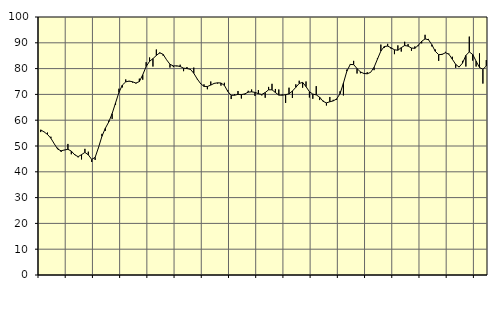
| Category | Piggar | Series 1 |
|---|---|---|
| nan | 55.4 | 56.25 |
| 87.0 | 55.5 | 55.45 |
| 87.0 | 55.2 | 54.48 |
| 87.0 | 53.6 | 53 |
| nan | 50.8 | 50.82 |
| 88.0 | 49.3 | 48.79 |
| 88.0 | 47.7 | 48.13 |
| 88.0 | 48.4 | 48.47 |
| nan | 50.8 | 48.72 |
| 89.0 | 46.8 | 48.03 |
| 89.0 | 46.9 | 46.59 |
| 89.0 | 45.6 | 45.87 |
| nan | 44.8 | 46.64 |
| 90.0 | 48.9 | 47.52 |
| 90.0 | 47.8 | 46.57 |
| 90.0 | 43.8 | 44.8 |
| nan | 44.6 | 45.58 |
| 91.0 | 49.2 | 49.44 |
| 91.0 | 54.7 | 53.76 |
| 91.0 | 55.9 | 56.87 |
| nan | 59.8 | 59.3 |
| 92.0 | 60.5 | 62.55 |
| 92.0 | 65.9 | 66.69 |
| 92.0 | 72.2 | 70.76 |
| nan | 72.7 | 73.61 |
| 93.0 | 75.8 | 74.86 |
| 93.0 | 75 | 75.17 |
| 93.0 | 74.6 | 74.88 |
| nan | 74.2 | 74.39 |
| 94.0 | 76.1 | 74.98 |
| 94.0 | 75.7 | 77.6 |
| 94.0 | 82.5 | 80.82 |
| nan | 84.3 | 82.81 |
| 95.0 | 80.8 | 83.87 |
| 95.0 | 87.4 | 85.09 |
| 95.0 | 85.9 | 86.15 |
| nan | 85 | 85.51 |
| 96.0 | 83.4 | 83.43 |
| 96.0 | 80.4 | 81.68 |
| 96.0 | 80.6 | 81.03 |
| nan | 80.9 | 81.08 |
| 97.0 | 81.5 | 80.82 |
| 97.0 | 79 | 80.17 |
| 97.0 | 80.6 | 80.03 |
| nan | 79.5 | 79.73 |
| 98.0 | 80.4 | 78.2 |
| 98.0 | 75.9 | 76.02 |
| 98.0 | 74.4 | 74.2 |
| nan | 73.9 | 73.1 |
| 99.0 | 72 | 73.06 |
| 99.0 | 75 | 73.61 |
| 99.0 | 74.4 | 74.27 |
| nan | 74.2 | 74.49 |
| 0.0 | 73.4 | 74.42 |
| 0.0 | 74.5 | 73.49 |
| 0.0 | 71.6 | 71.17 |
| nan | 68.2 | 69.64 |
| 1.0 | 70.1 | 69.68 |
| 1.0 | 71.3 | 70.01 |
| 1.0 | 68.4 | 69.91 |
| nan | 69.9 | 70.2 |
| 2.0 | 71.4 | 70.86 |
| 2.0 | 71.9 | 71 |
| 2.0 | 69.4 | 70.78 |
| nan | 71.7 | 70.28 |
| 3.0 | 69.6 | 69.96 |
| 3.0 | 68.7 | 70.72 |
| 3.0 | 72.9 | 71.78 |
| nan | 74.1 | 71.79 |
| 4.0 | 72.1 | 70.73 |
| 4.0 | 71.9 | 69.72 |
| 4.0 | 70 | 69.68 |
| nan | 66.7 | 69.89 |
| 5.0 | 72.6 | 70.22 |
| 5.0 | 68.6 | 71.31 |
| 5.0 | 73.9 | 72.74 |
| nan | 75.3 | 74.24 |
| 6.0 | 72.6 | 74.65 |
| 6.0 | 75 | 73.01 |
| 6.0 | 68.8 | 71.06 |
| nan | 68.3 | 70.11 |
| 7.0 | 73.2 | 69.82 |
| 7.0 | 67.8 | 68.94 |
| 7.0 | 67.6 | 67.33 |
| nan | 65.7 | 66.72 |
| 8.0 | 69 | 67.14 |
| 8.0 | 67.9 | 67.48 |
| 8.0 | 67.9 | 68.23 |
| nan | 71.2 | 70.26 |
| 9.0 | 69.6 | 74.36 |
| 9.0 | 79.6 | 78.98 |
| 9.0 | 81.8 | 81.6 |
| nan | 83 | 81.55 |
| 10.0 | 78.1 | 80.02 |
| 10.0 | 78.2 | 78.7 |
| 10.0 | 78 | 78.12 |
| nan | 78.6 | 77.98 |
| 11.0 | 78.6 | 78.56 |
| 11.0 | 79.4 | 80.49 |
| 11.0 | 84.1 | 83.67 |
| nan | 89.3 | 86.79 |
| 12.0 | 88 | 88.56 |
| 12.0 | 89.6 | 88.72 |
| 12.0 | 87.7 | 88.06 |
| nan | 85.6 | 87.29 |
| 13.0 | 89 | 87.11 |
| 13.0 | 86.6 | 88.12 |
| 13.0 | 90.4 | 88.94 |
| nan | 89.5 | 88.72 |
| 14.0 | 86.9 | 87.97 |
| 14.0 | 88.6 | 87.86 |
| 14.0 | 88.7 | 89.03 |
| nan | 89.8 | 90.58 |
| 15.0 | 93.1 | 91.51 |
| 15.0 | 91.5 | 91.19 |
| 15.0 | 88.6 | 89.25 |
| nan | 87.4 | 86.7 |
| 16.0 | 83 | 85.41 |
| 16.0 | 85.7 | 85.5 |
| 16.0 | 86.5 | 86.15 |
| nan | 85.8 | 85.58 |
| 17.0 | 84.6 | 83.65 |
| 17.0 | 80.3 | 81.64 |
| 17.0 | 80.8 | 80.59 |
| nan | 83 | 82.11 |
| 18.0 | 80.8 | 85.11 |
| 18.0 | 92.4 | 86.47 |
| 18.0 | 83.1 | 85.48 |
| nan | 80.8 | 82.9 |
| 19.0 | 85.9 | 80.44 |
| 19.0 | 74.2 | 79.74 |
| 19.0 | 83.3 | 81.01 |